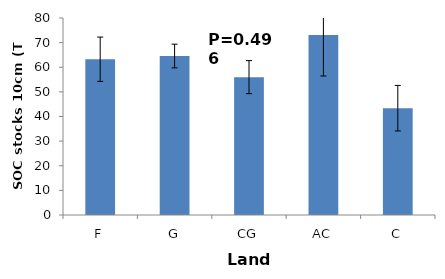
| Category | Series 0 |
|---|---|
| F | 63.253 |
| G | 64.564 |
| CG | 55.979 |
| AC | 73.078 |
| C | 43.381 |